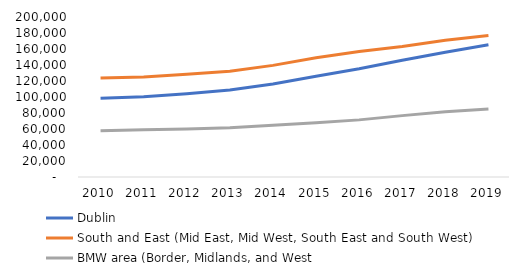
| Category | Dublin | South and East (Mid East, Mid West, South East and South West) | BMW area (Border, Midlands, and West |
|---|---|---|---|
| 2010.0 | 98506 | 123754 | 57951 |
| 2011.0 | 100227 | 124981 | 59032 |
| 2012.0 | 104210 | 128536 | 59913 |
| 2013.0 | 108816 | 132148 | 61636 |
| 2014.0 | 116372 | 139509 | 64552 |
| 2015.0 | 125827 | 149050 | 67820 |
| 2016.0 | 135195 | 156789 | 71406 |
| 2017.0 | 145851 | 163016 | 76723 |
| 2018.0 | 155965 | 170885 | 81668 |
| 2019.0 | 165241 | 176864 | 85046 |